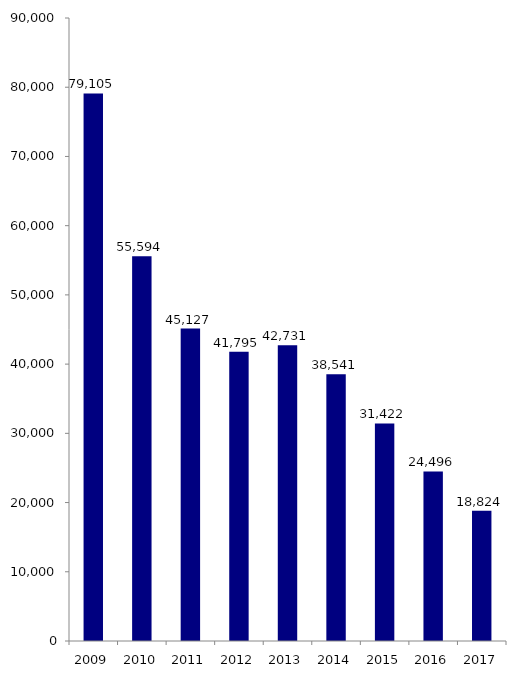
| Category | Caryotypes foetaux |
|---|---|
| 2009.0 | 79105 |
| 2010.0 | 55594 |
| 2011.0 | 45127 |
| 2012.0 | 41795 |
| 2013.0 | 42731 |
| 2014.0 | 38541 |
| 2015.0 | 31422 |
| 2016.0 | 24496 |
| 2017.0 | 18824 |